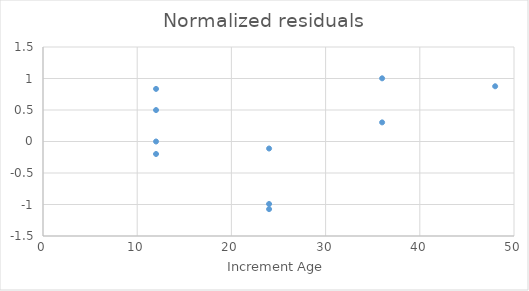
| Category | To 
(months) |
|---|---|
| 12.0 | -0.198 |
| 24.0 | -0.111 |
| 36.0 | 0.304 |
| 48.0 | 0.877 |
| 12.0 | 0.499 |
| 24.0 | -1.073 |
| 36.0 | 1.003 |
| 12.0 | 0.835 |
| 24.0 | -0.992 |
| 12.0 | 0 |